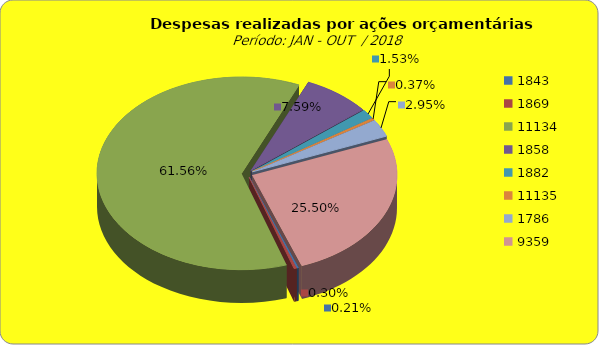
| Category | Series 1 |
|---|---|
| 1843.0 | 463765.58 |
| 1869.0 | 668469.13 |
| 11134.0 | 136656035.87 |
| 1858.0 | 16839205.25 |
| 1882.0 | 3389481.06 |
| 11135.0 | 827787.3 |
| 1786.0 | 6544244.48 |
| 9359.0 | 56594848.36 |